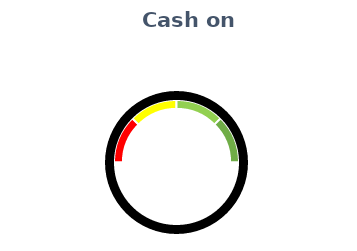
| Category | Speedometer |
|---|---|
| 0 | 0 |
| 1 | 0.25 |
| 2 | 0.25 |
| 3 | 0.25 |
| 4 | 0.25 |
| 5 | 1 |